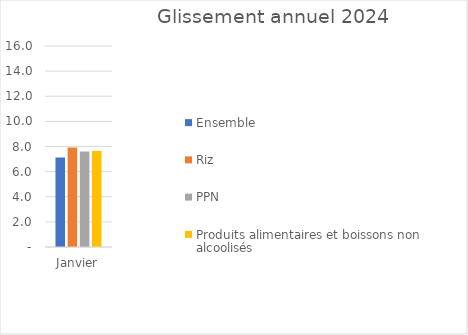
| Category |  Ensemble  |  Riz  |  PPN  |  Produits alimentaires et boissons non alcoolisés  |
|---|---|---|---|---|
| Janvier | 7.132 | 7.916 | 7.6 | 7.649 |